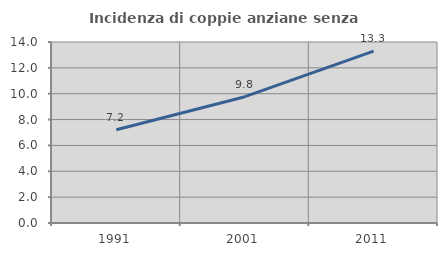
| Category | Incidenza di coppie anziane senza figli  |
|---|---|
| 1991.0 | 7.216 |
| 2001.0 | 9.77 |
| 2011.0 | 13.298 |